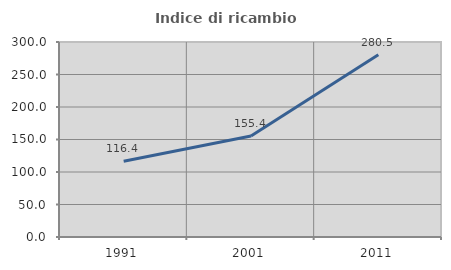
| Category | Indice di ricambio occupazionale  |
|---|---|
| 1991.0 | 116.441 |
| 2001.0 | 155.382 |
| 2011.0 | 280.508 |